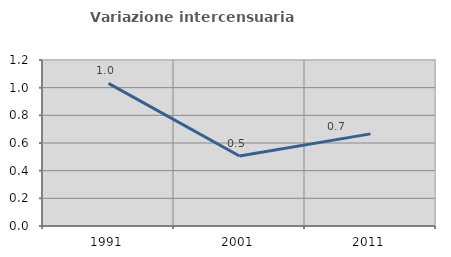
| Category | Variazione intercensuaria annua |
|---|---|
| 1991.0 | 1.031 |
| 2001.0 | 0.506 |
| 2011.0 | 0.666 |